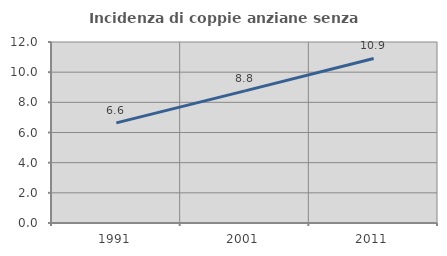
| Category | Incidenza di coppie anziane senza figli  |
|---|---|
| 1991.0 | 6.635 |
| 2001.0 | 8.762 |
| 2011.0 | 10.909 |